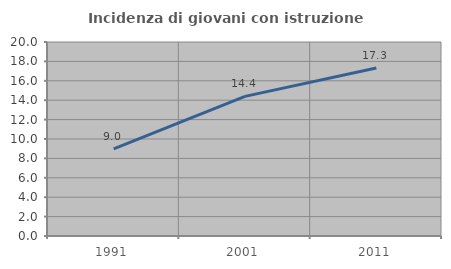
| Category | Incidenza di giovani con istruzione universitaria |
|---|---|
| 1991.0 | 8.989 |
| 2001.0 | 14.394 |
| 2011.0 | 17.323 |